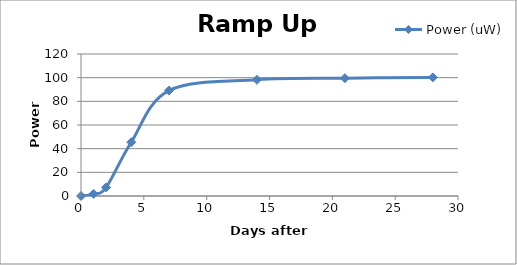
| Category | Power (uW) |
|---|---|
| 0.0 | 0 |
| 1.0 | 1.818 |
| 2.0 | 7.273 |
| 4.0 | 45.455 |
| 7.0 | 89.091 |
| 14.0 | 98.223 |
| 21.0 | 99.564 |
| 28.0 | 100.238 |